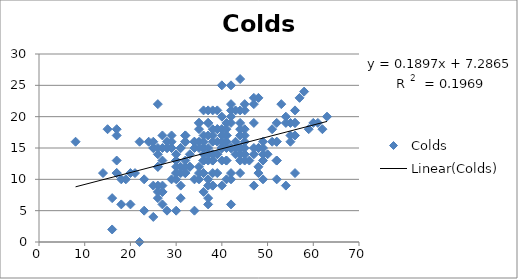
| Category | Colds |
|---|---|
| 44.0 | 18 |
| 41.0 | 18 |
| 17.0 | 18 |
| 35.0 | 15 |
| 33.0 | 14 |
| 44.0 | 15 |
| 39.0 | 18 |
| 35.0 | 10 |
| 43.0 | 16 |
| 43.0 | 14 |
| 41.0 | 16 |
| 47.0 | 19 |
| 41.0 | 13 |
| 30.0 | 12 |
| 15.0 | 18 |
| 39.0 | 18 |
| 36.0 | 11 |
| 41.0 | 13 |
| 37.0 | 10 |
| 43.0 | 21 |
| 32.0 | 13 |
| 17.0 | 13 |
| 34.0 | 15 |
| 32.0 | 11 |
| 19.0 | 10 |
| 44.0 | 26 |
| 30.0 | 13 |
| 42.0 | 25 |
| 34.0 | 5 |
| 36.0 | 8 |
| 42.0 | 15 |
| 47.0 | 15 |
| 55.0 | 19 |
| 27.0 | 15 |
| 28.0 | 15 |
| 45.0 | 22 |
| 29.0 | 10 |
| 37.0 | 13 |
| 52.0 | 13 |
| 34.0 | 16 |
| 48.0 | 23 |
| 40.0 | 15 |
| 29.0 | 16 |
| 34.0 | 10 |
| 35.0 | 19 |
| 57.0 | 23 |
| 48.0 | 11 |
| 41.0 | 10 |
| 40.0 | 13 |
| 36.0 | 13 |
| 26.0 | 7 |
| 29.0 | 15 |
| 52.0 | 16 |
| 28.0 | 16 |
| 35.0 | 11 |
| 42.0 | 15 |
| 54.0 | 19 |
| 56.0 | 19 |
| 37.0 | 9 |
| 41.0 | 17 |
| 32.0 | 16 |
| 63.0 | 20 |
| 31.0 | 15 |
| 36.0 | 15 |
| 31.0 | 12 |
| 25.0 | 15 |
| 40.0 | 25 |
| 55.0 | 16 |
| 37.0 | 21 |
| 28.0 | 15 |
| 56.0 | 21 |
| 24.0 | 16 |
| 61.0 | 19 |
| 40.0 | 16 |
| 50.0 | 14 |
| 52.0 | 10 |
| 45.0 | 14 |
| 42.0 | 19 |
| 47.0 | 23 |
| 22.0 | 0 |
| 26.0 | 12 |
| 38.0 | 13 |
| 46.0 | 13 |
| 27.0 | 9 |
| 45.0 | 21 |
| 43.0 | 15 |
| 17.0 | 11 |
| 45.0 | 16 |
| 40.0 | 15 |
| 41.0 | 17 |
| 37.0 | 15 |
| 30.0 | 10 |
| 37.0 | 14 |
| 31.0 | 9 |
| 49.0 | 10 |
| 44.0 | 15 |
| 16.0 | 2 |
| 25.0 | 4 |
| 30.0 | 5 |
| 20.0 | 6 |
| 36.0 | 11 |
| 39.0 | 14 |
| 49.0 | 13 |
| 37.0 | 19 |
| 20.0 | 11 |
| 48.0 | 12 |
| 28.0 | 5 |
| 51.0 | 16 |
| 36.0 | 21 |
| 42.0 | 6 |
| 47.0 | 9 |
| 17.0 | 11 |
| 22.0 | 16 |
| 42.0 | 21 |
| 32.0 | 11 |
| 31.0 | 7 |
| 49.0 | 16 |
| 30.0 | 11 |
| 31.0 | 11 |
| 38.0 | 18 |
| 44.0 | 14 |
| 41.0 | 17 |
| 40.0 | 20 |
| 32.0 | 17 |
| 48.0 | 15 |
| 29.0 | 17 |
| 40.0 | 18 |
| 45.0 | 18 |
| 40.0 | 15 |
| 35.0 | 18 |
| 37.0 | 17 |
| 41.0 | 16 |
| 25.0 | 16 |
| 35.0 | 19 |
| 44.0 | 15 |
| 58.0 | 24 |
| 27.0 | 13 |
| 42.0 | 22 |
| 26.0 | 9 |
| 48.0 | 15 |
| 30.0 | 11 |
| 36.0 | 13 |
| 26.0 | 8 |
| 27.0 | 6 |
| 39.0 | 14 |
| 17.0 | 17 |
| 44.0 | 21 |
| 41.0 | 19 |
| 26.0 | 14 |
| 30.0 | 14 |
| 36.0 | 13 |
| 31.0 | 15 |
| 55.0 | 17 |
| 45.0 | 17 |
| 27.0 | 17 |
| 25.0 | 9 |
| 42.0 | 15 |
| 18.0 | 6 |
| 49.0 | 15 |
| 60.0 | 19 |
| 40.0 | 18 |
| 29.0 | 15 |
| 32.0 | 12 |
| 35.0 | 16 |
| 45.0 | 15 |
| 42.0 | 11 |
| 52.0 | 13 |
| 52.0 | 16 |
| 8.0 | 16 |
| 36.0 | 15 |
| 33.0 | 12 |
| 38.0 | 17 |
| 38.0 | 11 |
| 38.0 | 14 |
| 36.0 | 16 |
| 44.0 | 11 |
| 36.0 | 14 |
| 35.0 | 12 |
| 30.0 | 13 |
| 39.0 | 21 |
| 37.0 | 7 |
| 26.0 | 22 |
| 51.0 | 18 |
| 42.0 | 10 |
| 44.0 | 19 |
| 41.0 | 15 |
| 32.0 | 16 |
| 56.0 | 19 |
| 47.0 | 22 |
| 39.0 | 11 |
| 18.0 | 10 |
| 33.0 | 12 |
| 49.0 | 14 |
| 16.0 | 7 |
| 38.0 | 9 |
| 27.0 | 8 |
| 26.0 | 15 |
| 27.0 | 8 |
| 25.0 | 15 |
| 14.0 | 11 |
| 40.0 | 9 |
| 38.0 | 9 |
| 38.0 | 13 |
| 62.0 | 18 |
| 47.0 | 14 |
| 54.0 | 9 |
| 37.0 | 6 |
| 40.0 | 17 |
| 56.0 | 17 |
| 38.0 | 16 |
| 53.0 | 22 |
| 52.0 | 19 |
| 21.0 | 11 |
| 34.0 | 16 |
| 23.0 | 5 |
| 44.0 | 13 |
| 36.0 | 17 |
| 45.0 | 14 |
| 23.0 | 10 |
| 26.0 | 12 |
| 54.0 | 20 |
| 37.0 | 19 |
| 56.0 | 11 |
| 38.0 | 14 |
| 59.0 | 18 |
| 39.0 | 16 |
| 38.0 | 21 |
| 42.0 | 20 |
| 44.0 | 17 |
| 32.0 | 17 |
| 45.0 | 13 |